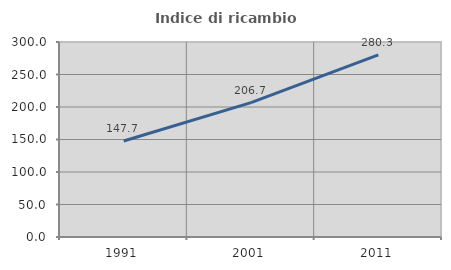
| Category | Indice di ricambio occupazionale  |
|---|---|
| 1991.0 | 147.68 |
| 2001.0 | 206.701 |
| 2011.0 | 280.255 |